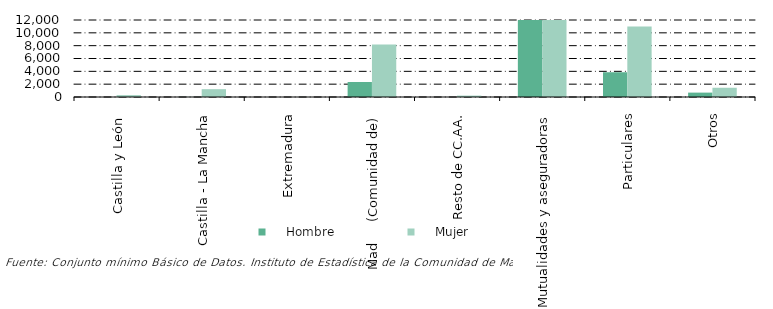
| Category |     Hombre |     Mujer |
|---|---|---|
| Castilla y León  | 1 | 296 |
| Castilla - La Mancha | 16 | 1220 |
| Extremadura | 0 | 7 |
| Madrid (Comunidad de) | 2335 | 8185 |
| Resto de CC.AA. | 5 | 220 |
| Mutualidades y aseguradoras | 58814 | 75186 |
| Particulares | 3858 | 10985 |
| Otros | 684 | 1440 |